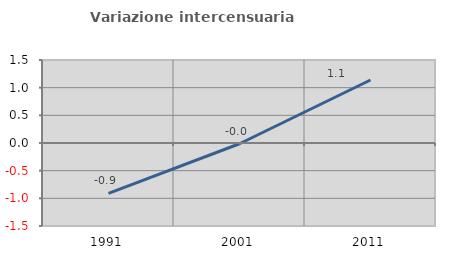
| Category | Variazione intercensuaria annua |
|---|---|
| 1991.0 | -0.91 |
| 2001.0 | -0.013 |
| 2011.0 | 1.138 |